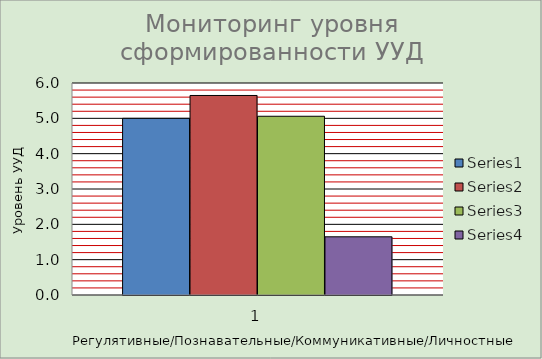
| Category | Series 0 | Series 1 | Series 2 | Series 3 |
|---|---|---|---|---|
| 0 | 5 | 5.647 | 5.059 | 1.647 |